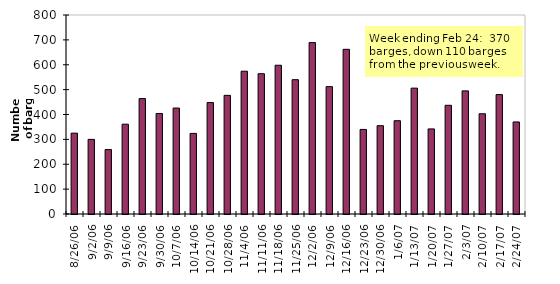
| Category | Upbound Empties |
|---|---|
| 8/26/06 | 325 |
| 9/2/06 | 300 |
| 9/9/06 | 259 |
| 9/16/06 | 361 |
| 9/23/06 | 464 |
| 9/30/06 | 404 |
| 10/7/06 | 426 |
| 10/14/06 | 324 |
| 10/21/06 | 448 |
| 10/28/06 | 477 |
| 11/4/06 | 574 |
| 11/11/06 | 564 |
| 11/18/06 | 598 |
| 11/25/06 | 540 |
| 12/2/06 | 689 |
| 12/9/06 | 512 |
| 12/16/06 | 662 |
| 12/23/06 | 340 |
| 12/30/06 | 355 |
| 1/6/07 | 375 |
| 1/13/07 | 506 |
| 1/20/07 | 342 |
| 1/27/07 | 437 |
| 2/3/07 | 495 |
| 2/10/07 | 403 |
| 2/17/07 | 480 |
| 2/24/07 | 370 |